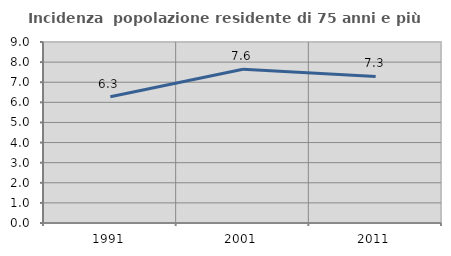
| Category | Incidenza  popolazione residente di 75 anni e più |
|---|---|
| 1991.0 | 6.28 |
| 2001.0 | 7.642 |
| 2011.0 | 7.29 |